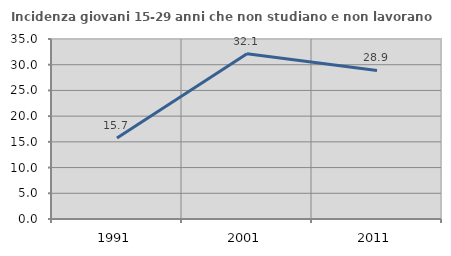
| Category | Incidenza giovani 15-29 anni che non studiano e non lavorano  |
|---|---|
| 1991.0 | 15.741 |
| 2001.0 | 32.143 |
| 2011.0 | 28.889 |